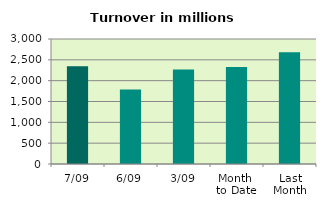
| Category | Series 0 |
|---|---|
| 7/09 | 2343.276 |
| 6/09 | 1787.916 |
| 3/09 | 2265.634 |
| Month 
to Date | 2326.07 |
| Last
Month | 2681.097 |